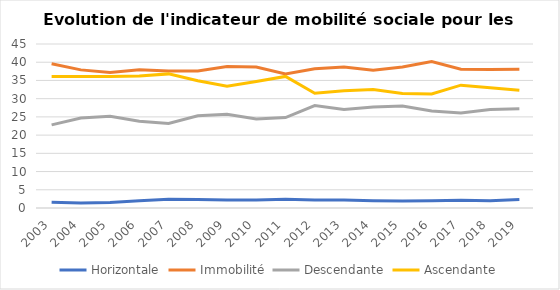
| Category | Horizontale | Immobilité | Descendante | Ascendante |
|---|---|---|---|---|
| 2003.0 | 1.6 | 39.6 | 22.8 | 36.1 |
| 2004.0 | 1.4 | 37.9 | 24.7 | 36.1 |
| 2005.0 | 1.5 | 37.2 | 25.2 | 36.1 |
| 2006.0 | 2 | 37.9 | 23.8 | 36.2 |
| 2007.0 | 2.4 | 37.6 | 23.2 | 36.8 |
| 2008.0 | 2.3 | 37.6 | 25.3 | 34.9 |
| 2009.0 | 2.2 | 38.8 | 25.7 | 33.4 |
| 2010.0 | 2.2 | 38.7 | 24.4 | 34.7 |
| 2011.0 | 2.4 | 36.8 | 24.8 | 36.1 |
| 2012.0 | 2.2 | 38.2 | 28.1 | 31.5 |
| 2013.0 | 2.2 | 38.7 | 27 | 32.2 |
| 2014.0 | 2 | 37.8 | 27.7 | 32.5 |
| 2015.0 | 1.9 | 38.7 | 28 | 31.4 |
| 2016.0 | 2 | 40.2 | 26.6 | 31.3 |
| 2017.0 | 2.1 | 38.1 | 26.1 | 33.7 |
| 2018.0 | 2 | 38 | 27 | 33 |
| 2019.0 | 2.3 | 38.1 | 27.2 | 32.3 |